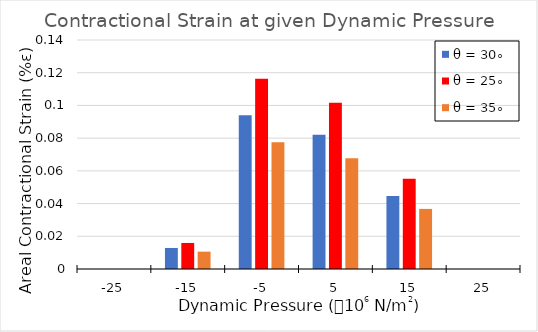
| Category | θ = 30∘ | θ = 25∘ | θ = 35∘ |
|---|---|---|---|
| -25.0 | 0 | 0 | 0 |
| -15.0 | 0.013 | 0.016 | 0.011 |
| -5.0 | 0.094 | 0.116 | 0.078 |
| 5.0 | 0.082 | 0.102 | 0.068 |
| 15.0 | 0.045 | 0.055 | 0.037 |
| 25.0 | 0 | 0 | 0 |